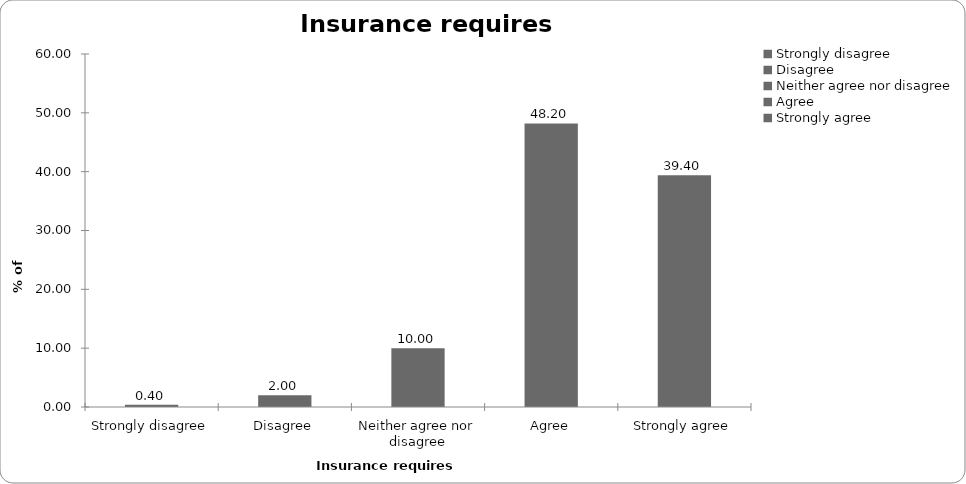
| Category | Insurance requires regulation |
|---|---|
| Strongly disagree | 0.4 |
| Disagree | 2 |
| Neither agree nor disagree | 10 |
| Agree | 48.2 |
| Strongly agree | 39.4 |